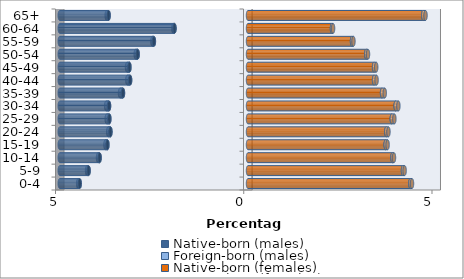
| Category | Native-born (males) | Foreign-born (males) | Native-born (females) | Foreign-born (females) |
|---|---|---|---|---|
| 0-4 | -4.471 | -0.041 | 4.312 | 0.045 |
| 5-9 | -4.234 | -0.04 | 4.117 | 0.044 |
| 10-14 | -3.942 | -0.042 | 3.835 | 0.043 |
| 15-19 | -3.734 | -0.052 | 3.656 | 0.052 |
| 20-24 | -3.654 | -0.059 | 3.672 | 0.059 |
| 25-29 | -3.683 | -0.07 | 3.819 | 0.069 |
| 30-34 | -3.691 | -0.076 | 3.922 | 0.073 |
| 35-39 | -3.321 | -0.078 | 3.56 | 0.072 |
| 40-44 | -3.131 | -0.074 | 3.348 | 0.067 |
| 45-49 | -3.15 | -0.064 | 3.349 | 0.058 |
| 50-54 | -2.931 | -0.051 | 3.14 | 0.048 |
| 55-59 | -2.5 | -0.039 | 2.763 | 0.038 |
| 60-64 | -1.953 | -0.031 | 2.23 | 0.03 |
| 65+ | -3.703 | -0.05 | 4.653 | 0.063 |